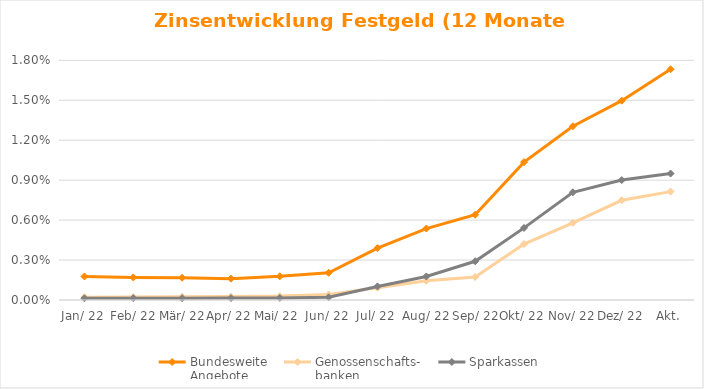
| Category | Bundesweite
Angebote | Genossenschafts-
banken | Sparkassen |
|---|---|---|---|
| Jan. 22 | 0.002 | 0 | 0 |
| Feb. 22 | 0.002 | 0 | 0 |
| Mrz. 22 | 0.002 | 0 | 0 |
| Apr. 22 | 0.002 | 0 | 0 |
| Mai. 22 | 0.002 | 0 | 0 |
| Jun. 22 | 0.002 | 0 | 0 |
| Jul. 22 | 0.004 | 0.001 | 0.001 |
| Aug. 22 | 0.005 | 0.001 | 0.002 |
| Sep. 22 | 0.006 | 0.002 | 0.003 |
| Okt. 22 | 0.01 | 0.004 | 0.005 |
| Nov. 22 | 0.013 | 0.006 | 0.008 |
| Dez. 22 | 0.015 | 0.007 | 0.009 |
| Akt. | 0.017 | 0.008 | 0.009 |